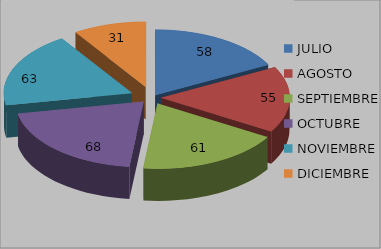
| Category | Series 0 |
|---|---|
| JULIO | 58 |
| AGOSTO | 55 |
| SEPTIEMBRE | 61 |
| OCTUBRE | 68 |
| NOVIEMBRE | 63 |
| DICIEMBRE | 31 |